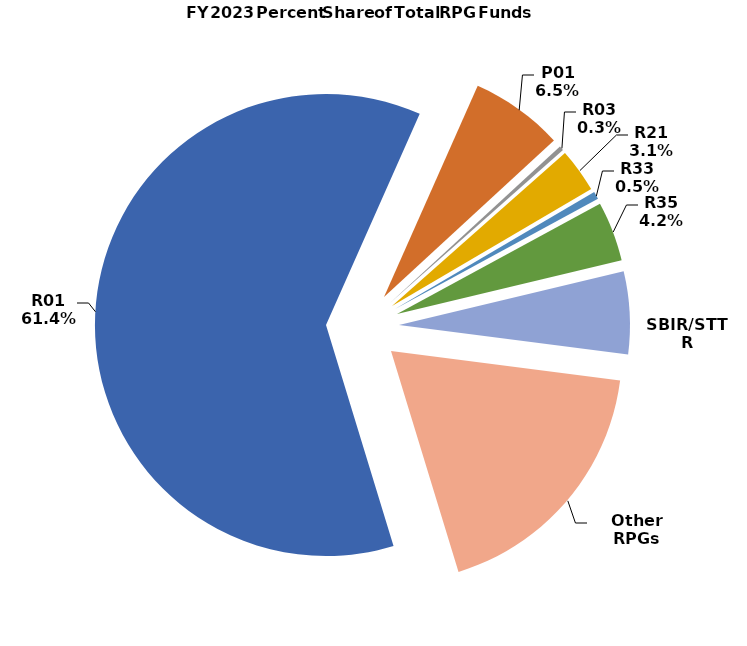
| Category | Series 1 |
|---|---|
| R01 | 0.614 |
| P01 | 0.065 |
| R03 | 0.003 |
| R21 | 0.031 |
| R33 | 0.005 |
| R35 | 0.042 |
| SBIR/STTR | 0.058 |
| Other RPGs | 0.182 |